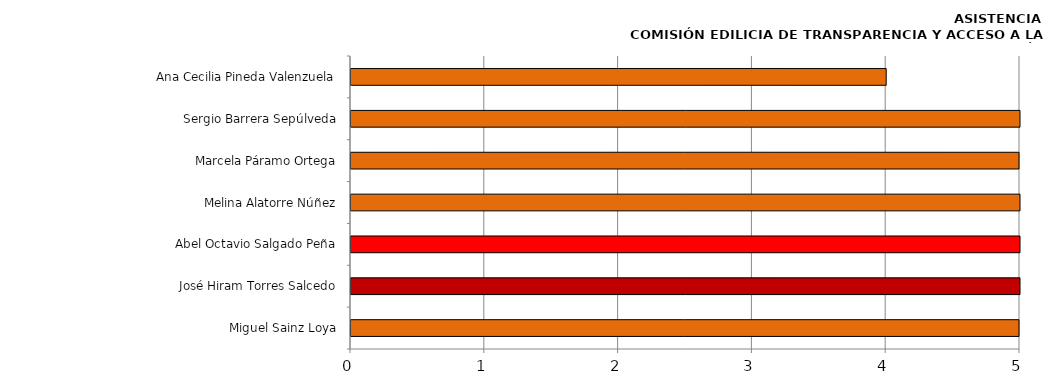
| Category | Series 0 |
|---|---|
| Miguel Sainz Loya | 6 |
| José Hiram Torres Salcedo | 5 |
| Abel Octavio Salgado Peña | 5 |
| Melina Alatorre Núñez | 5 |
| Marcela Páramo Ortega | 6 |
| Sergio Barrera Sepúlveda | 5 |
| Ana Cecilia Pineda Valenzuela | 4 |